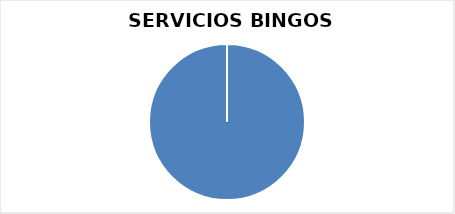
| Category | Series 0 |
|---|---|
| 0 | 724 |
| 1 | 0 |